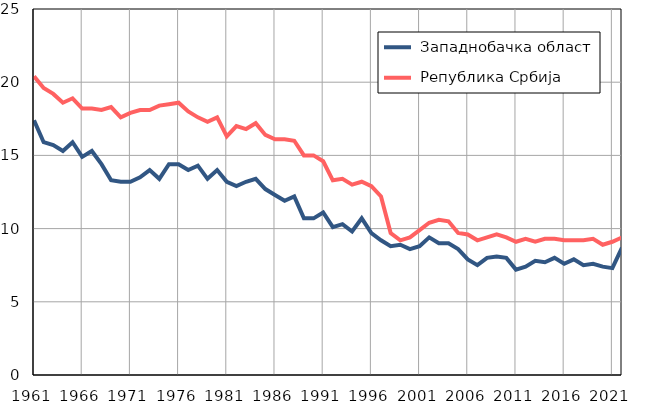
| Category |  Западнобачка област |  Република Србија |
|---|---|---|
| 1961.0 | 17.4 | 20.4 |
| 1962.0 | 15.9 | 19.6 |
| 1963.0 | 15.7 | 19.2 |
| 1964.0 | 15.3 | 18.6 |
| 1965.0 | 15.9 | 18.9 |
| 1966.0 | 14.9 | 18.2 |
| 1967.0 | 15.3 | 18.2 |
| 1968.0 | 14.4 | 18.1 |
| 1969.0 | 13.3 | 18.3 |
| 1970.0 | 13.2 | 17.6 |
| 1971.0 | 13.2 | 17.9 |
| 1972.0 | 13.5 | 18.1 |
| 1973.0 | 14 | 18.1 |
| 1974.0 | 13.4 | 18.4 |
| 1975.0 | 14.4 | 18.5 |
| 1976.0 | 14.4 | 18.6 |
| 1977.0 | 14 | 18 |
| 1978.0 | 14.3 | 17.6 |
| 1979.0 | 13.4 | 17.3 |
| 1980.0 | 14 | 17.6 |
| 1981.0 | 13.2 | 16.3 |
| 1982.0 | 12.9 | 17 |
| 1983.0 | 13.2 | 16.8 |
| 1984.0 | 13.4 | 17.2 |
| 1985.0 | 12.7 | 16.4 |
| 1986.0 | 12.3 | 16.1 |
| 1987.0 | 11.9 | 16.1 |
| 1988.0 | 12.2 | 16 |
| 1989.0 | 10.7 | 15 |
| 1990.0 | 10.7 | 15 |
| 1991.0 | 11.1 | 14.6 |
| 1992.0 | 10.1 | 13.3 |
| 1993.0 | 10.3 | 13.4 |
| 1994.0 | 9.8 | 13 |
| 1995.0 | 10.7 | 13.2 |
| 1996.0 | 9.7 | 12.9 |
| 1997.0 | 9.2 | 12.2 |
| 1998.0 | 8.8 | 9.7 |
| 1999.0 | 8.9 | 9.2 |
| 2000.0 | 8.6 | 9.4 |
| 2001.0 | 8.8 | 9.9 |
| 2002.0 | 9.4 | 10.4 |
| 2003.0 | 9 | 10.6 |
| 2004.0 | 9 | 10.5 |
| 2005.0 | 8.6 | 9.7 |
| 2006.0 | 7.9 | 9.6 |
| 2007.0 | 7.5 | 9.2 |
| 2008.0 | 8 | 9.4 |
| 2009.0 | 8.1 | 9.6 |
| 2010.0 | 8 | 9.4 |
| 2011.0 | 7.2 | 9.1 |
| 2012.0 | 7.4 | 9.3 |
| 2013.0 | 7.8 | 9.1 |
| 2014.0 | 7.7 | 9.3 |
| 2015.0 | 8 | 9.3 |
| 2016.0 | 7.6 | 9.2 |
| 2017.0 | 7.9 | 9.2 |
| 2018.0 | 7.5 | 9.2 |
| 2019.0 | 7.6 | 9.3 |
| 2020.0 | 7.4 | 8.9 |
| 2021.0 | 7.3 | 9.1 |
| 2022.0 | 8.7 | 9.4 |